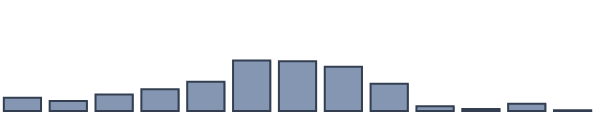
| Category | Series 0 |
|---|---|
| 0 | 4.773 |
| 1 | 3.561 |
| 2 | 5.985 |
| 3 | 7.803 |
| 4 | 10.53 |
| 5 | 18.182 |
| 6 | 17.955 |
| 7 | 15.909 |
| 8 | 9.848 |
| 9 | 1.742 |
| 10 | 0.758 |
| 11 | 2.652 |
| 12 | 0.303 |